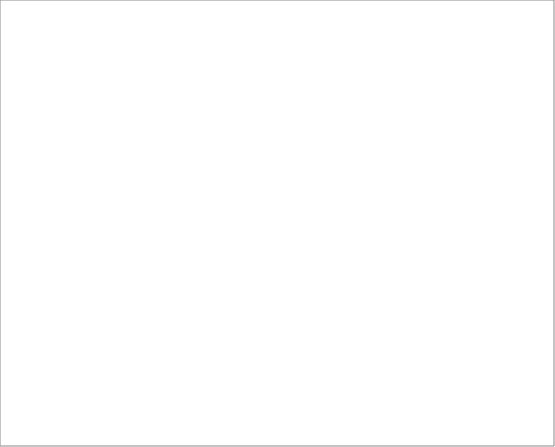
| Category | Series 0 |
|---|---|
| ACL | 0 |
| ADA | 0 |
| AFA | 0 |
| AFK | 0 |
| AKA | 0 |
| AKAF | 0 |
| AKAT | 0 |
| ALB | 0 |
| ALU | 0 |
| AMR | 0 |
| ARA | 0 |
| ARAA | 0 |
| ARAG | 0 |
| ARAI | 0 |
| ARAM | 0 |
| ARAS | 0 |
| ARAY | 0 |
| ARM | 0 |
| ASM | 0 |
| ASR | 0 |
| AYB | 0 |
| AYM | 0 |
| AZE | 0 |
| BAI | 0 |
| BAL | 0 |
| BEJ | 0 |
| BEL | 0 |
| BEM | 0 |
| BHO | 0 |
| BIK | 0 |
| BLT | 0 |
| BMA | 0 |
| BNG | 0 |
| BNGA | 0 |
| BNGC | 0 |
| BNGS | 0 |
| BSL | 0 |
| BSQ | 0 |
| BUL | 0 |
| CAM | 0 |
| CAT | 0 |
| CCE | 0 |
| CCF | 0 |
| CGA | 0 |
| CGR | 0 |
| CHE | 0 |
| CHI | 0 |
| CHIA | 0 |
| CHIC | 0 |
| CHIH | 0 |
| CHIK | 0 |
| CHIM | 0 |
| CKW | 0 |
| CRN | 0 |
| CTR | 0 |
| CWA | 0 |
| CYM | 0 |
| CZE | 0 |
| DAN | 0 |
| DGA | 0 |
| DGB | 0 |
| DIN | 0 |
| DUT | 0 |
| DZO | 0 |
| EBI | 0 |
| EDO | 0 |
| EFI | 0 |
| ENB | 0 |
| ENG | 0 |
| ESA | 0 |
| EST | 0 |
| EWE | 0 |
| EWO | 0 |
| FAN | 0 |
| FIJ | 0 |
| FIN | 0 |
| FON | 0 |
| FRN | 0 |
| FUL | 0 |
| GAA | 0 |
| GAE | 0 |
| GAL | 0 |
| GEO | 0 |
| GER | 0 |
| GGO | 0 |
| GKY | 0 |
| GLG | 0 |
| GRE | 0 |
| GREA | 0 |
| GREC | 0 |
| GRN | 0 |
| GUJ | 0 |
| GUN | 0 |
| GUR | 0 |
| HAU | 0 |
| HDK | 0 |
| HEB | 0 |
| HER | 0 |
| HGR | 0 |
| HIN | 0 |
| IBA | 0 |
| IDM | 0 |
| IGA | 0 |
| IGB | 0 |
| IJO | 0 |
| ILO | 0 |
| ISK | 0 |
| ISL | 0 |
| ITA | 0 |
| JAV | 0 |
| JIN | 0 |
| JPN | 0 |
| KAM | 0 |
| KAN | 0 |